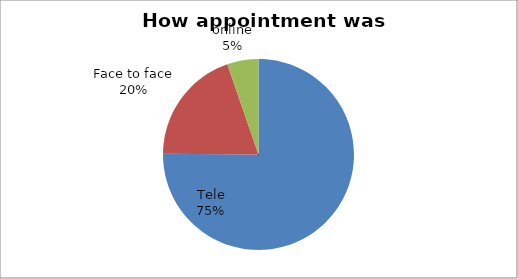
| Category | Series 0 |
|---|---|
| Tele | 284 |
| Face to face | 74 |
| online | 20 |